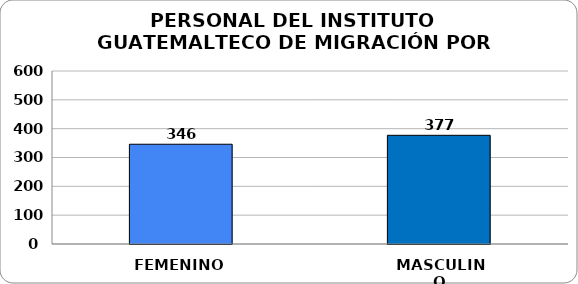
| Category | Series 0 |
|---|---|
| FEMENINO | 346 |
| MASCULINO | 377 |